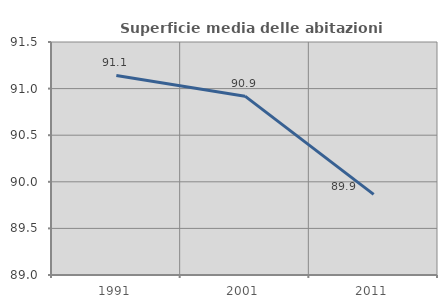
| Category | Superficie media delle abitazioni occupate |
|---|---|
| 1991.0 | 91.141 |
| 2001.0 | 90.919 |
| 2011.0 | 89.865 |